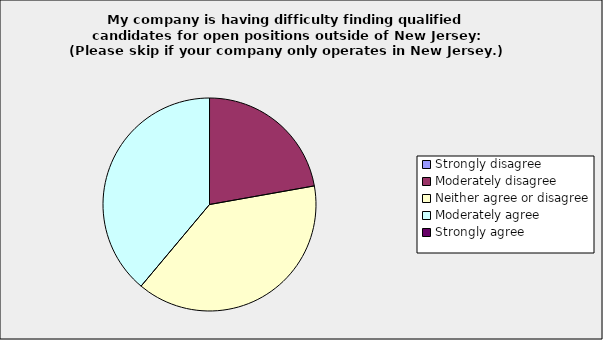
| Category | Series 0 |
|---|---|
| Strongly disagree | 0 |
| Moderately disagree | 0.222 |
| Neither agree or disagree | 0.389 |
| Moderately agree | 0.389 |
| Strongly agree | 0 |